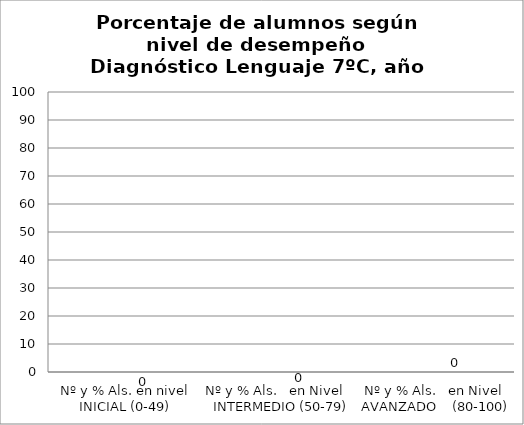
| Category | Series 0 | Series 1 | Series 2 | Series 3 |
|---|---|---|---|---|
| Nº y % Als. en nivel INICIAL (0-49) |  |  |  | 0 |
| Nº y % Als.   en Nivel    INTERMEDIO (50-79) |  |  |  | 0 |
| Nº y % Als.   en Nivel  AVANZADO    (80-100) |  |  |  | 0 |